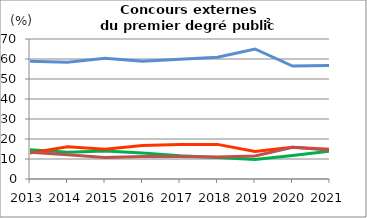
| Category | Étudiants | Enseignants et personnels d'éducation et de surveillance                            | Autres emplois dans secteurs public ou privé                | Sans emploi                    |
|---|---|---|---|---|
| 2013.0 | 58.879 | 14.658 | 12.998 | 13.4 |
| 2014.0 | 58.408 | 13.385 | 16.112 | 12.096 |
| 2015.0 | 60.4 | 14 | 14.9 | 10.7 |
| 2016.0 | 58.9 | 13 | 16.8 | 11.3 |
| 2017.0 | 59.9 | 11.6 | 17.2 | 11.3 |
| 2018.0 | 60.9 | 10.8 | 17.3 | 11 |
| 2019.0 | 65 | 9.7 | 13.8 | 11.5 |
| 2020.0 | 56.5 | 11.7 | 15.9 | 15.9 |
| 2021.0 | 56.7 | 13.9 | 14.9 | 14.5 |